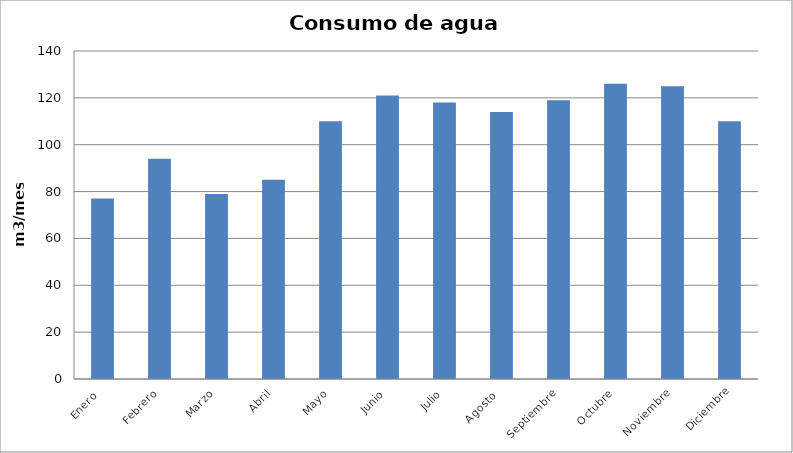
| Category | Series 0 |
|---|---|
| Enero  | 77 |
| Febrero | 94 |
| Marzo | 79 |
| Abril | 85 |
| Mayo | 110 |
| Junio | 121 |
| Julio | 118 |
| Agosto  | 114 |
| Septiembre | 119 |
| Octubre | 126 |
| Noviembre | 125 |
| Diciembre | 110 |